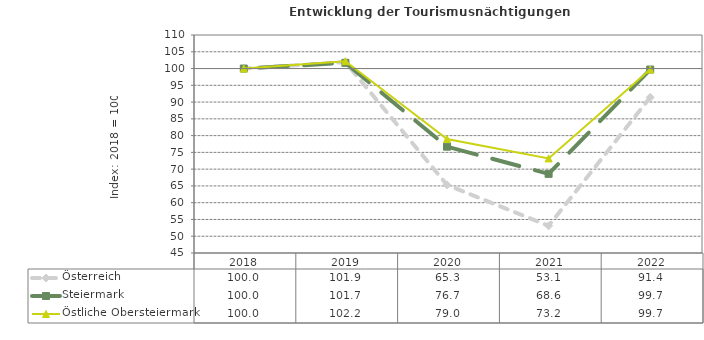
| Category | Österreich | Steiermark | Östliche Obersteiermark |
|---|---|---|---|
| 2022.0 | 91.4 | 99.7 | 99.7 |
| 2021.0 | 53.1 | 68.6 | 73.2 |
| 2020.0 | 65.3 | 76.7 | 79 |
| 2019.0 | 101.9 | 101.7 | 102.2 |
| 2018.0 | 100 | 100 | 100 |